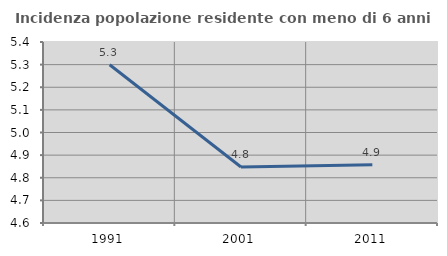
| Category | Incidenza popolazione residente con meno di 6 anni |
|---|---|
| 1991.0 | 5.3 |
| 2001.0 | 4.848 |
| 2011.0 | 4.858 |